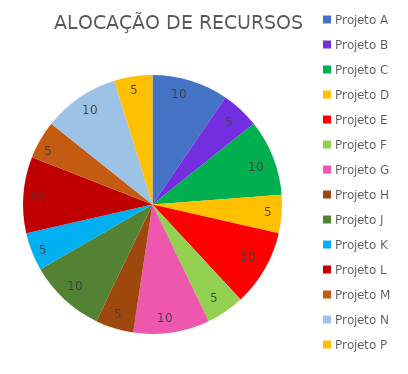
| Category | Series 0 |
|---|---|
| Projeto A | 10 |
| Projeto B | 5 |
| Projeto C | 10 |
| Projeto D | 5 |
| Projeto E | 10 |
| Projeto F | 5 |
| Projeto G | 10 |
| Projeto H | 5 |
| Projeto J | 10 |
| Projeto K | 5 |
| Projeto L | 10 |
| Projeto M | 5 |
| Projeto N | 10 |
| Projeto P | 5 |